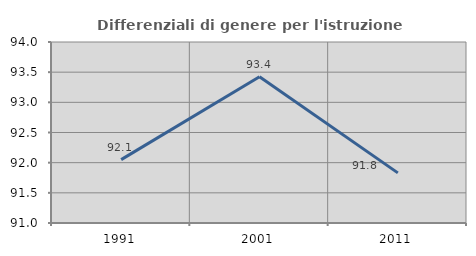
| Category | Differenziali di genere per l'istruzione superiore |
|---|---|
| 1991.0 | 92.05 |
| 2001.0 | 93.423 |
| 2011.0 | 91.831 |